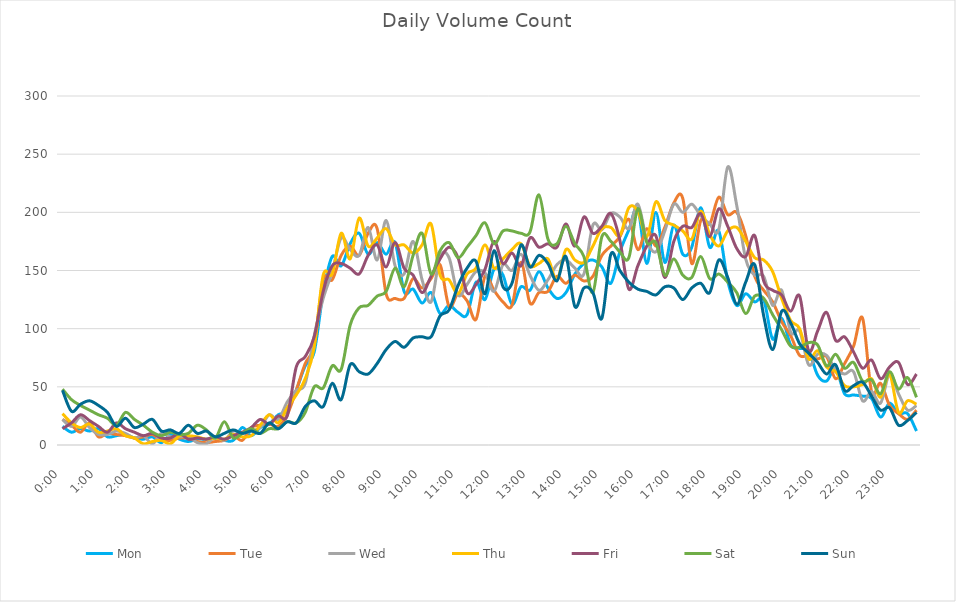
| Category | Mon | Tue | Wed | Thu | Fri | Sat | Sun |
|---|---|---|---|---|---|---|---|
| 0.0 | 16 | 22 | 22 | 27 | 14 | 48 | 47 |
| 0.010416666666666666 | 11 | 17 | 16 | 19 | 19 | 39 | 29 |
| 0.020833333333333332 | 14 | 11 | 24 | 15 | 26 | 34 | 35 |
| 0.03125 | 12 | 19 | 15 | 18 | 21 | 30 | 38 |
| 0.041666666666666664 | 14 | 7 | 9 | 11 | 16 | 26 | 34 |
| 0.05208333333333333 | 7 | 10 | 9 | 12 | 11 | 23 | 28 |
| 0.06249999999999999 | 8 | 9 | 12 | 14 | 19 | 17 | 16 |
| 0.07291666666666666 | 9 | 8 | 10 | 8 | 14 | 28 | 23 |
| 0.08333333333333333 | 6 | 6 | 6 | 6 | 11 | 22 | 15 |
| 0.09375 | 5 | 7 | 8 | 1 | 8 | 17 | 18 |
| 0.10416666666666667 | 7 | 9 | 1 | 3 | 10 | 11 | 22 |
| 0.11458333333333334 | 2 | 4 | 10 | 4 | 6 | 8 | 12 |
| 0.125 | 9 | 4 | 7 | 1 | 6 | 11 | 13 |
| 0.13541666666666666 | 5 | 6 | 7 | 8 | 10 | 9 | 10 |
| 0.14583333333333331 | 3 | 6 | 7 | 8 | 5 | 10 | 17 |
| 0.15624999999999997 | 5 | 3 | 2 | 7 | 6 | 17 | 10 |
| 0.16666666666666663 | 5 | 2 | 1 | 5 | 5 | 13 | 12 |
| 0.1770833333333333 | 6 | 3 | 7 | 6 | 7 | 6 | 7 |
| 0.18749999999999994 | 4 | 4 | 4 | 5 | 5 | 20 | 10 |
| 0.1979166666666666 | 4 | 8 | 12 | 9 | 8 | 6 | 13 |
| 0.20833333333333326 | 15 | 4 | 10 | 7 | 11 | 10 | 10 |
| 0.21874999999999992 | 8 | 15 | 12 | 8 | 15 | 14 | 12 |
| 0.22916666666666657 | 15 | 17 | 15 | 17 | 22 | 10 | 10 |
| 0.23958333333333323 | 18 | 18 | 26 | 26 | 18 | 14 | 19 |
| 0.2499999999999999 | 26 | 16 | 22 | 19 | 25 | 14 | 14 |
| 0.2604166666666666 | 29 | 26 | 37 | 32 | 25 | 20 | 20 |
| 0.27083333333333326 | 47 | 47 | 47 | 43 | 67 | 19 | 19 |
| 0.28124999999999994 | 68 | 70 | 53 | 57 | 76 | 28 | 33 |
| 0.29166666666666663 | 80 | 86 | 94 | 84 | 93 | 50 | 38 |
| 0.3020833333333333 | 131 | 142 | 126 | 146 | 132 | 49 | 33 |
| 0.3125 | 162 | 142 | 149 | 147 | 154 | 68 | 53 |
| 0.3229166666666667 | 154 | 163 | 178 | 182 | 156 | 65 | 39 |
| 0.33333333333333337 | 173 | 171 | 168 | 160 | 152 | 103 | 69 |
| 0.34375000000000006 | 182 | 163 | 163 | 195 | 147 | 118 | 63 |
| 0.35416666666666674 | 164 | 182 | 187 | 171 | 163 | 120 | 61 |
| 0.3645833333333334 | 174 | 186 | 159 | 178 | 172 | 128 | 70 |
| 0.3750000000000001 | 164 | 130 | 193 | 186 | 153 | 132 | 82 |
| 0.3854166666666668 | 174 | 126 | 154 | 172 | 174 | 152 | 89 |
| 0.3958333333333335 | 132 | 126 | 147 | 172 | 152 | 136 | 84 |
| 0.40625000000000017 | 134 | 143 | 175 | 165 | 146 | 163 | 92 |
| 0.41666666666666685 | 122 | 135 | 142 | 172 | 131 | 182 | 93 |
| 0.4270833333333333 | 131 | 143 | 123 | 190 | 145 | 147 | 93 |
| 0.4375000000000002 | 113 | 155 | 162 | 146 | 160 | 167 | 111 |
| 0.4479166666666669 | 120 | 119 | 161 | 142 | 170 | 174 | 116 |
| 0.4583333333333333 | 114 | 130 | 129 | 130 | 161 | 161 | 137 |
| 0.4687500000000003 | 112 | 124 | 138 | 147 | 131 | 170 | 152 |
| 0.47916666666666696 | 140 | 108 | 149 | 152 | 138 | 180 | 158 |
| 0.4895833333333333 | 125 | 145 | 148 | 172 | 151 | 191 | 130 |
| 0.5000000000000003 | 151 | 133 | 132 | 152 | 175 | 173 | 167 |
| 0.510416666666667 | 146 | 123 | 155 | 160 | 156 | 184 | 136 |
| 0.5208333333333334 | 121 | 120 | 150 | 168 | 165 | 184 | 139 |
| 0.5312500000000002 | 136 | 157 | 164 | 173 | 154 | 182 | 172 |
| 0.5416666666666669 | 133 | 122 | 146 | 154 | 178 | 183 | 153 |
| 0.5520833333333335 | 149 | 131 | 133 | 156 | 170 | 215 | 163 |
| 0.5625000000000001 | 135 | 132 | 142 | 160 | 173 | 177 | 156 |
| 0.5729166666666667 | 126 | 145 | 155 | 142 | 170 | 173 | 141 |
| 0.5833333333333334 | 131 | 139 | 159 | 168 | 190 | 188 | 162 |
| 0.59375 | 147 | 146 | 152 | 159 | 171 | 173 | 119 |
| 0.6041666666666666 | 156 | 141 | 147 | 157 | 196 | 162 | 135 |
| 0.6145833333333333 | 159 | 145 | 189 | 171 | 182 | 131 | 131 |
| 0.6249999999999999 | 153 | 163 | 185 | 186 | 188 | 179 | 109 |
| 0.6354166666666665 | 139 | 171 | 199 | 187 | 199 | 175 | 164 |
| 0.6458333333333331 | 166 | 179 | 196 | 180 | 176 | 166 | 150 |
| 0.6562499999999998 | 185 | 194 | 186 | 204 | 134 | 161 | 140 |
| 0.6666666666666666 | 203 | 168 | 207 | 201 | 154 | 203 | 134 |
| 0.677083333333333 | 156 | 186 | 176 | 179 | 171 | 174 | 132 |
| 0.6874999999999997 | 200 | 171 | 166 | 209 | 180 | 174 | 129 |
| 0.6979166666666666 | 157 | 187 | 184 | 193 | 144 | 146 | 136 |
| 0.7083333333333329 | 189 | 208 | 207 | 189 | 175 | 160 | 135 |
| 0.7187499999999996 | 164 | 212 | 200 | 184 | 188 | 146 | 125 |
| 0.7291666666666666 | 170 | 156 | 207 | 177 | 187 | 144 | 135 |
| 0.7395833333333328 | 204 | 193 | 197 | 201 | 199 | 162 | 139 |
| 0.75 | 170 | 190 | 190 | 181 | 179 | 143 | 131 |
| 0.7604166666666666 | 184 | 213 | 185 | 171 | 203 | 147 | 159 |
| 0.7708333333333327 | 141 | 198 | 239 | 184 | 188 | 140 | 144 |
| 0.78125 | 120 | 200 | 206 | 187 | 169 | 131 | 121 |
| 0.7916666666666666 | 130 | 180 | 160 | 175 | 162 | 113 | 140 |
| 0.8020833333333326 | 123 | 145 | 146 | 161 | 180 | 128 | 155 |
| 0.8125 | 125 | 133 | 145 | 159 | 141 | 126 | 111 |
| 0.8229166666666666 | 91 | 123 | 120 | 149 | 133 | 112 | 82 |
| 0.8333333333333334 | 109 | 106 | 133 | 126 | 129 | 99 | 115 |
| 0.84375 | 86 | 94 | 97 | 107 | 115 | 85 | 105 |
| 0.8541666666666666 | 83 | 77 | 98 | 100 | 128 | 84 | 87 |
| 0.8645833333333334 | 81 | 77 | 69 | 74 | 81 | 88 | 79 |
| 0.875 | 60 | 74 | 78 | 81 | 98 | 86 | 71 |
| 0.8854166666666666 | 55 | 76 | 77 | 67 | 114 | 68 | 61 |
| 0.8958333333333334 | 66 | 57 | 65 | 63 | 90 | 78 | 69 |
| 0.90625 | 44 | 70 | 61 | 51 | 93 | 66 | 47 |
| 0.9166666666666666 | 43 | 85 | 63 | 50 | 80 | 71 | 51 |
| 0.9270833333333334 | 42 | 109 | 38 | 52 | 66 | 55 | 54 |
| 0.9375 | 40 | 46 | 46 | 57 | 73 | 56 | 42 |
| 0.9479166666666666 | 24 | 53 | 36 | 41 | 57 | 44 | 30 |
| 0.9583333333333334 | 36 | 34 | 61 | 61 | 67 | 63 | 32 |
| 0.96875 | 27 | 27 | 44 | 28 | 71 | 48 | 17 |
| 0.9791666666666666 | 27 | 22 | 30 | 38 | 52 | 58 | 21 |
| 0.9895833333333334 | 12 | 30 | 34 | 35 | 61 | 41 | 28 |